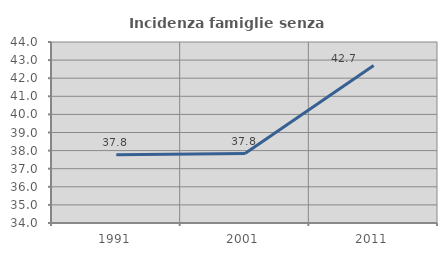
| Category | Incidenza famiglie senza nuclei |
|---|---|
| 1991.0 | 37.773 |
| 2001.0 | 37.835 |
| 2011.0 | 42.707 |